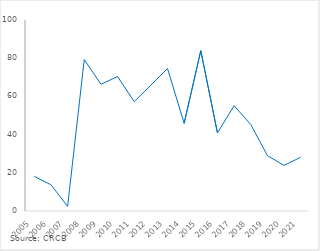
| Category | Series 0 |
|---|---|
| 2005.0 | 18.137 |
| 2006.0 | 13.726 |
| 2007.0 | 2.415 |
| 2008.0 | 79.301 |
| 2009.0 | 66.358 |
| 2010.0 | 70.382 |
| 2011.0 | 57.263 |
| 2012.0 | 65.922 |
| 2013.0 | 74.614 |
| 2014.0 | 45.879 |
| 2015.0 | 83.945 |
| 2016.0 | 40.933 |
| 2017.0 | 55.097 |
| 2018.0 | 45.328 |
| 2019.0 | 29.022 |
| 2020.0 | 23.855 |
| 2021.0 | 28.135 |